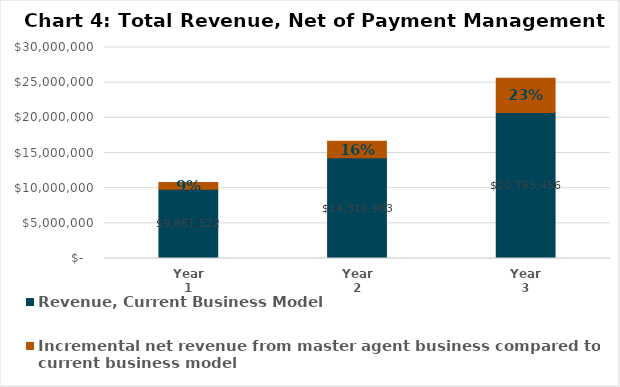
| Category | Revenue, Current Business Model | Incremental net revenue from master agent business compared to current business model |
|---|---|---|
| Year 1 | 9861521.577 | 934365.738 |
| Year 2 | 14310962.641 | 2354025.29 |
| Year 3 | 20763455.704 | 4865350.607 |